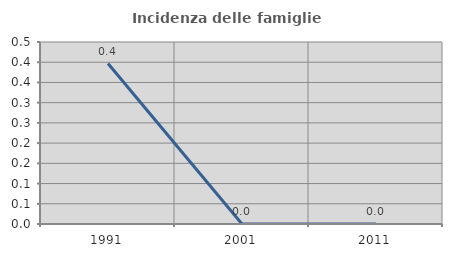
| Category | Incidenza delle famiglie numerose |
|---|---|
| 1991.0 | 0.397 |
| 2001.0 | 0 |
| 2011.0 | 0 |